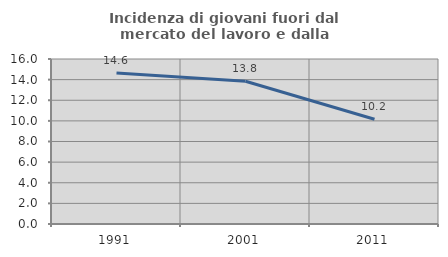
| Category | Incidenza di giovani fuori dal mercato del lavoro e dalla formazione  |
|---|---|
| 1991.0 | 14.634 |
| 2001.0 | 13.839 |
| 2011.0 | 10.154 |